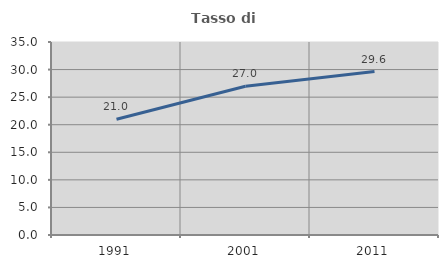
| Category | Tasso di occupazione   |
|---|---|
| 1991.0 | 20.987 |
| 2001.0 | 26.988 |
| 2011.0 | 29.648 |